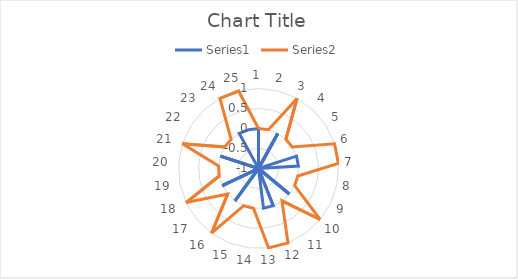
| Category | Series 0 | Series 1 |
|---|---|---|
| 0 | 0 | 0 |
| 1 | -1 | 0 |
| 2 | 0 | 1 |
| 3 | -1 | 0 |
| 4 | -1 | 0 |
| 5 | 0 | 1 |
| 6 | 0 | 1 |
| 7 | -1 | 0 |
| 8 | -1 | 0 |
| 9 | 0 | 1 |
| 10 | -1 | 0 |
| 11 | 0 | 1 |
| 12 | 0 | 1 |
| 13 | -1 | 0 |
| 14 | -1 | 0 |
| 15 | 0 | 1 |
| 16 | -1 | 0 |
| 17 | 0 | 1 |
| 18 | -1 | 0 |
| 19 | -1 | 0 |
| 20 | 0 | 1 |
| 21 | -1 | 0 |
| 22 | -1 | 0 |
| 23 | 0 | 1 |
| 24 | 0 | 1 |